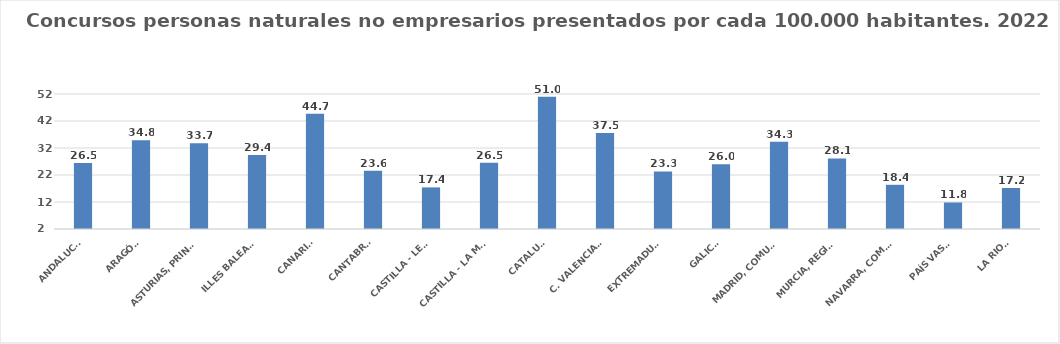
| Category | Series 0 |
|---|---|
| ANDALUCÍA | 26.452 |
| ARAGÓN | 34.833 |
| ASTURIAS, PRINCIPADO | 33.742 |
| ILLES BALEARS | 29.405 |
| CANARIAS | 44.726 |
| CANTABRIA | 23.574 |
| CASTILLA - LEÓN | 17.407 |
| CASTILLA - LA MANCHA | 26.494 |
| CATALUÑA | 51.023 |
| C. VALENCIANA | 37.544 |
| EXTREMADURA | 23.322 |
| GALICIA | 25.981 |
| MADRID, COMUNIDAD | 34.309 |
| MURCIA, REGIÓN | 28.135 |
| NAVARRA, COM. FORAL | 18.37 |
| PAÍS VASCO | 11.82 |
| LA RIOJA | 17.193 |